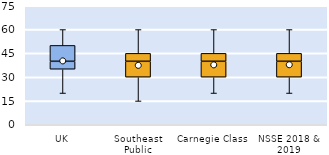
| Category | 25th | 50th | 75th |
|---|---|---|---|
| UK | 35 | 5 | 10 |
| Southeast Public | 30 | 10 | 5 |
| Carnegie Class | 30 | 10 | 5 |
| NSSE 2018 & 2019 | 30 | 10 | 5 |